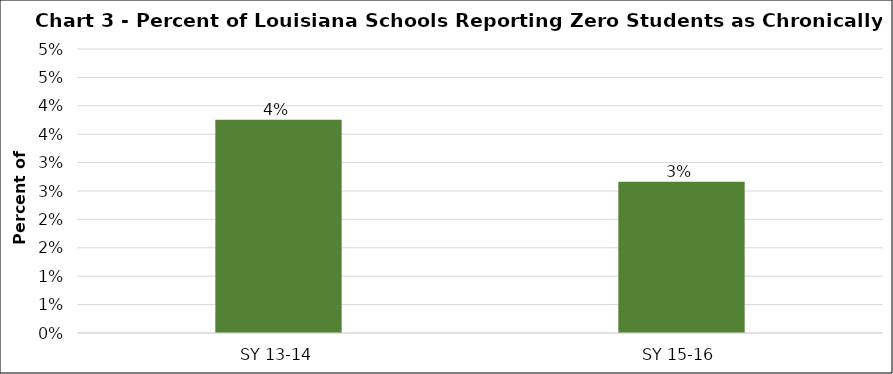
| Category | Series 0 |
|---|---|
| SY 13-14 | 0.038 |
| SY 15-16 | 0.027 |